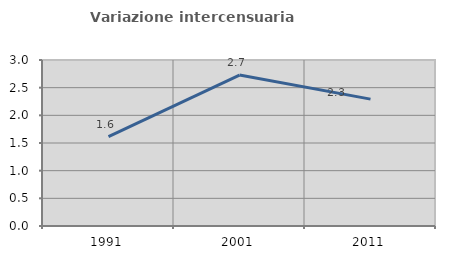
| Category | Variazione intercensuaria annua |
|---|---|
| 1991.0 | 1.616 |
| 2001.0 | 2.729 |
| 2011.0 | 2.293 |